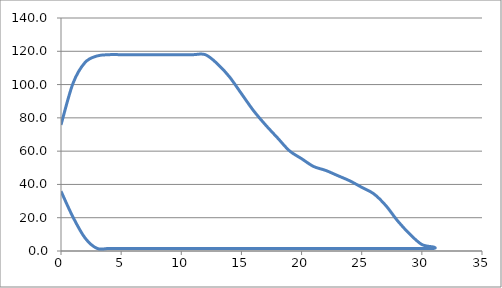
| Category | Series 0 |
|---|---|
| 0.0 | 75.781 |
| 1.0 | 100.781 |
| 2.0 | 113.281 |
| 3.0 | 117.188 |
| 4.0 | 117.969 |
| 5.0 | 117.969 |
| 6.0 | 117.969 |
| 7.0 | 117.969 |
| 8.0 | 117.969 |
| 9.0 | 117.969 |
| 10.0 | 117.969 |
| 11.0 | 117.969 |
| 12.0 | 117.969 |
| 13.0 | 112.5 |
| 14.0 | 104.688 |
| 15.0 | 94.531 |
| 16.0 | 84.375 |
| 17.0 | 75.781 |
| 18.0 | 67.969 |
| 19.0 | 60.156 |
| 20.0 | 55.469 |
| 21.0 | 50.781 |
| 22.0 | 48.438 |
| 23.0 | 45.312 |
| 24.0 | 42.188 |
| 25.0 | 38.281 |
| 26.0 | 34.375 |
| 27.0 | 27.344 |
| 28.0 | 17.969 |
| 29.0 | 10.156 |
| 30.0 | 3.906 |
| 31.0 | 2.344 |
| 31.0 | 1.562 |
| 30.0 | 1.562 |
| 29.0 | 1.562 |
| 28.0 | 1.562 |
| 27.0 | 1.562 |
| 26.0 | 1.562 |
| 25.0 | 1.562 |
| 24.0 | 1.562 |
| 23.0 | 1.562 |
| 22.0 | 1.562 |
| 21.0 | 1.562 |
| 20.0 | 1.562 |
| 19.0 | 1.562 |
| 18.0 | 1.562 |
| 17.0 | 1.562 |
| 16.0 | 1.562 |
| 15.0 | 1.562 |
| 14.0 | 1.562 |
| 13.0 | 1.562 |
| 12.0 | 1.562 |
| 11.0 | 1.562 |
| 10.0 | 1.562 |
| 9.0 | 1.562 |
| 8.0 | 1.562 |
| 7.0 | 1.562 |
| 6.0 | 1.562 |
| 5.0 | 1.562 |
| 4.0 | 1.562 |
| 3.0 | 1.562 |
| 2.0 | 7.812 |
| 1.0 | 20.312 |
| 0.0 | 35.938 |